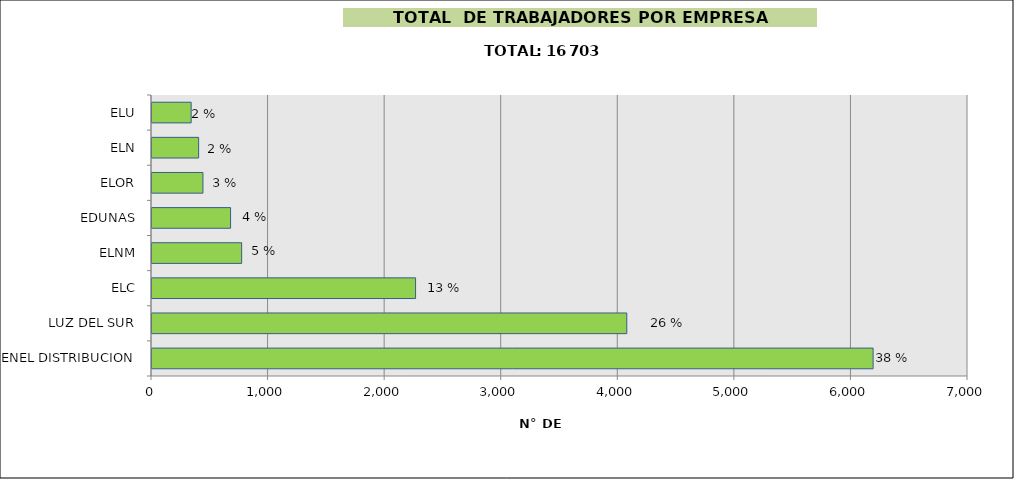
| Category | Series 0 |
|---|---|
| ENEL DISTRIBUCION | 6186 |
| LUZ DEL SUR | 4073 |
| ELC | 2261 |
| ELNM | 769 |
| EDUNAS | 674 |
| ELOR | 437 |
| ELN | 400 |
| ELU | 336 |